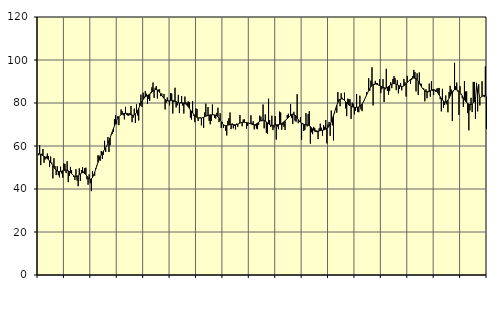
| Category | Piggar | Series 1 |
|---|---|---|
| nan | 55.7 | 56.43 |
| 87.0 | 60.3 | 56.22 |
| 87.0 | 51.1 | 56.12 |
| 87.0 | 56.4 | 55.76 |
| 87.0 | 58.6 | 55.48 |
| 87.0 | 52.2 | 55.18 |
| 87.0 | 53.7 | 54.89 |
| 87.0 | 55.1 | 54.53 |
| 87.0 | 56.5 | 54.13 |
| 87.0 | 55.2 | 53.66 |
| 87.0 | 50.2 | 53.07 |
| 87.0 | 55.1 | 52.41 |
| nan | 52.3 | 51.68 |
| 88.0 | 44.9 | 50.88 |
| 88.0 | 54.3 | 50.09 |
| 88.0 | 50.6 | 49.36 |
| 88.0 | 46.5 | 48.76 |
| 88.0 | 50.6 | 48.35 |
| 88.0 | 46.4 | 48.15 |
| 88.0 | 45.4 | 48.1 |
| 88.0 | 50.4 | 48.16 |
| 88.0 | 47.2 | 48.29 |
| 88.0 | 45.3 | 48.46 |
| 88.0 | 51.9 | 48.63 |
| nan | 51.6 | 48.72 |
| 89.0 | 47.4 | 48.76 |
| 89.0 | 52.9 | 48.68 |
| 89.0 | 43.2 | 48.45 |
| 89.0 | 46.1 | 48.09 |
| 89.0 | 50.3 | 47.63 |
| 89.0 | 48.7 | 47.11 |
| 89.0 | 46.7 | 46.6 |
| 89.0 | 45.6 | 46.17 |
| 89.0 | 44.2 | 45.87 |
| 89.0 | 49.2 | 45.8 |
| 89.0 | 43.9 | 45.92 |
| nan | 41.3 | 46.2 |
| 90.0 | 49.6 | 46.6 |
| 90.0 | 43.7 | 47.03 |
| 90.0 | 48.7 | 47.39 |
| 90.0 | 50.1 | 47.6 |
| 90.0 | 48.1 | 47.56 |
| 90.0 | 49.7 | 47.23 |
| 90.0 | 49.9 | 46.67 |
| 90.0 | 44.5 | 45.96 |
| 90.0 | 42 | 45.26 |
| 90.0 | 46.8 | 44.72 |
| 90.0 | 42.7 | 44.5 |
| nan | 39 | 44.72 |
| 91.0 | 48.3 | 45.38 |
| 91.0 | 46.2 | 46.44 |
| 91.0 | 46.2 | 47.8 |
| 91.0 | 49.7 | 49.32 |
| 91.0 | 51.1 | 50.86 |
| 91.0 | 55.7 | 52.36 |
| 91.0 | 55.5 | 53.71 |
| 91.0 | 53.1 | 54.91 |
| 91.0 | 57.7 | 55.95 |
| 91.0 | 54 | 56.85 |
| 91.0 | 56 | 57.63 |
| nan | 62.4 | 58.39 |
| 92.0 | 57.2 | 59.19 |
| 92.0 | 59.9 | 60.11 |
| 92.0 | 64.2 | 61.19 |
| 92.0 | 57.2 | 62.42 |
| 92.0 | 60.3 | 63.75 |
| 92.0 | 65.4 | 65.14 |
| 92.0 | 65.7 | 66.58 |
| 92.0 | 66.6 | 68.02 |
| 92.0 | 72.5 | 69.41 |
| 92.0 | 74.4 | 70.7 |
| 92.0 | 70.1 | 71.88 |
| nan | 73.8 | 72.87 |
| 93.0 | 69.7 | 73.63 |
| 93.0 | 74.2 | 74.2 |
| 93.0 | 77 | 74.6 |
| 93.0 | 76.2 | 74.87 |
| 93.0 | 74.3 | 75.05 |
| 93.0 | 72.4 | 75.16 |
| 93.0 | 78.2 | 75.18 |
| 93.0 | 74.6 | 75.17 |
| 93.0 | 74.2 | 75.08 |
| 93.0 | 74.1 | 74.91 |
| 93.0 | 75.3 | 74.69 |
| nan | 78.6 | 74.49 |
| 94.0 | 71.1 | 74.35 |
| 94.0 | 73.2 | 74.34 |
| 94.0 | 77.4 | 74.48 |
| 94.0 | 70.7 | 74.85 |
| 94.0 | 79.4 | 75.49 |
| 94.0 | 74.2 | 76.39 |
| 94.0 | 71.9 | 77.49 |
| 94.0 | 80 | 78.66 |
| 94.0 | 83.9 | 79.78 |
| 94.0 | 78.2 | 80.8 |
| 94.0 | 84.8 | 81.66 |
| nan | 83 | 82.32 |
| 95.0 | 85.6 | 82.81 |
| 95.0 | 84.3 | 83.2 |
| 95.0 | 79.6 | 83.52 |
| 95.0 | 81.9 | 83.82 |
| 95.0 | 81 | 84.18 |
| 95.0 | 85 | 84.58 |
| 95.0 | 87.3 | 85.04 |
| 95.0 | 89.5 | 85.53 |
| 95.0 | 82.4 | 85.94 |
| 95.0 | 87.1 | 86.21 |
| 95.0 | 87.9 | 86.27 |
| nan | 82.1 | 86.08 |
| 96.0 | 86.2 | 85.63 |
| 96.0 | 86.3 | 84.97 |
| 96.0 | 83.2 | 84.21 |
| 96.0 | 84.4 | 83.47 |
| 96.0 | 82.8 | 82.78 |
| 96.0 | 84.2 | 82.16 |
| 96.0 | 77 | 81.67 |
| 96.0 | 80.2 | 81.3 |
| 96.0 | 82.6 | 81.07 |
| 96.0 | 80.8 | 81.01 |
| 96.0 | 78.9 | 81.01 |
| nan | 84.6 | 81.04 |
| 97.0 | 84.4 | 81.09 |
| 97.0 | 75.1 | 81.1 |
| 97.0 | 80.4 | 81.02 |
| 97.0 | 87.1 | 80.86 |
| 97.0 | 77.9 | 80.63 |
| 97.0 | 78.9 | 80.36 |
| 97.0 | 83.8 | 80.14 |
| 97.0 | 75.3 | 80.03 |
| 97.0 | 80.2 | 80 |
| 97.0 | 83.2 | 80.02 |
| 97.0 | 78.8 | 80.06 |
| nan | 75.1 | 80.01 |
| 98.0 | 83 | 79.81 |
| 98.0 | 80.2 | 79.45 |
| 98.0 | 80.1 | 78.95 |
| 98.0 | 80.7 | 78.29 |
| 98.0 | 80.5 | 77.54 |
| 98.0 | 73.2 | 76.78 |
| 98.0 | 72.3 | 76.05 |
| 98.0 | 80.9 | 75.38 |
| 98.0 | 74 | 74.75 |
| 98.0 | 71.1 | 74.18 |
| 98.0 | 77.5 | 73.67 |
| nan | 77.2 | 73.29 |
| 99.0 | 71.6 | 73.07 |
| 99.0 | 73.2 | 72.98 |
| 99.0 | 73.2 | 72.98 |
| 99.0 | 69.6 | 73.04 |
| 99.0 | 73 | 73.15 |
| 99.0 | 68.4 | 73.34 |
| 99.0 | 75.6 | 73.59 |
| 99.0 | 79.7 | 73.85 |
| 99.0 | 73.9 | 74.09 |
| 99.0 | 78.1 | 74.28 |
| 99.0 | 71.7 | 74.41 |
| nan | 70.1 | 74.48 |
| 0.0 | 71.7 | 74.5 |
| 0.0 | 79.3 | 74.5 |
| 0.0 | 74.6 | 74.48 |
| 0.0 | 73 | 74.45 |
| 0.0 | 72.8 | 74.35 |
| 0.0 | 75.4 | 74.09 |
| 0.0 | 77.8 | 73.62 |
| 0.0 | 71.1 | 72.91 |
| 0.0 | 75.2 | 72.06 |
| 0.0 | 68.4 | 71.2 |
| 0.0 | 71.2 | 70.44 |
| nan | 68.5 | 69.9 |
| 1.0 | 69.4 | 69.59 |
| 1.0 | 67.1 | 69.48 |
| 1.0 | 64.9 | 69.53 |
| 1.0 | 71.7 | 69.66 |
| 1.0 | 72.9 | 69.83 |
| 1.0 | 75.6 | 69.97 |
| 1.0 | 67.9 | 70.04 |
| 1.0 | 70.5 | 70.02 |
| 1.0 | 68.2 | 69.95 |
| 1.0 | 69.3 | 69.89 |
| 1.0 | 67.7 | 69.9 |
| nan | 70.4 | 69.99 |
| 2.0 | 68.9 | 70.17 |
| 2.0 | 70.4 | 70.41 |
| 2.0 | 74.4 | 70.67 |
| 2.0 | 70.9 | 70.88 |
| 2.0 | 69.2 | 71.01 |
| 2.0 | 72.3 | 71.04 |
| 2.0 | 72.4 | 71.01 |
| 2.0 | 71.1 | 70.96 |
| 2.0 | 68.1 | 70.89 |
| 2.0 | 69.3 | 70.8 |
| 2.0 | 70.6 | 70.67 |
| nan | 70.3 | 70.51 |
| 3.0 | 74.3 | 70.3 |
| 3.0 | 70.7 | 70.1 |
| 3.0 | 71.5 | 69.94 |
| 3.0 | 67.7 | 69.89 |
| 3.0 | 69.5 | 70.02 |
| 3.0 | 68.1 | 70.31 |
| 3.0 | 67.8 | 70.68 |
| 3.0 | 69.9 | 71.09 |
| 3.0 | 74.1 | 71.48 |
| 3.0 | 73.6 | 71.8 |
| 3.0 | 71.5 | 71.99 |
| nan | 79.3 | 72.01 |
| 4.0 | 68.2 | 71.85 |
| 4.0 | 74.7 | 71.56 |
| 4.0 | 66.2 | 71.19 |
| 4.0 | 65.6 | 70.76 |
| 4.0 | 82 | 70.33 |
| 4.0 | 72.1 | 69.95 |
| 4.0 | 68.8 | 69.68 |
| 4.0 | 74.1 | 69.57 |
| 4.0 | 67.4 | 69.58 |
| 4.0 | 68.6 | 69.67 |
| 4.0 | 73.9 | 69.78 |
| nan | 63 | 69.85 |
| 5.0 | 69 | 69.89 |
| 5.0 | 67.8 | 69.92 |
| 5.0 | 76 | 69.98 |
| 5.0 | 75.6 | 70.16 |
| 5.0 | 67.6 | 70.45 |
| 5.0 | 69.8 | 70.82 |
| 5.0 | 68.9 | 71.27 |
| 5.0 | 67.5 | 71.73 |
| 5.0 | 72.1 | 72.2 |
| 5.0 | 74.4 | 72.7 |
| 5.0 | 75 | 73.2 |
| nan | 73.9 | 73.73 |
| 6.0 | 79.5 | 74.25 |
| 6.0 | 73 | 74.65 |
| 6.0 | 70.2 | 74.85 |
| 6.0 | 75.9 | 74.76 |
| 6.0 | 71.8 | 74.4 |
| 6.0 | 71.3 | 73.82 |
| 6.0 | 84.1 | 73.07 |
| 6.0 | 70.6 | 72.3 |
| 6.0 | 71.4 | 71.61 |
| 6.0 | 73.4 | 71.05 |
| 6.0 | 62.9 | 70.62 |
| nan | 70.7 | 70.31 |
| 7.0 | 67 | 70.1 |
| 7.0 | 67.5 | 69.96 |
| 7.0 | 75.3 | 69.91 |
| 7.0 | 69.1 | 69.86 |
| 7.0 | 74.8 | 69.72 |
| 7.0 | 76.2 | 69.45 |
| 7.0 | 61.1 | 69.03 |
| 7.0 | 66.4 | 68.47 |
| 7.0 | 65.5 | 67.88 |
| 7.0 | 68.9 | 67.32 |
| 7.0 | 68.3 | 66.9 |
| nan | 67.3 | 66.69 |
| 8.0 | 67.2 | 66.66 |
| 8.0 | 63.2 | 66.79 |
| 8.0 | 68.2 | 66.97 |
| 8.0 | 70.4 | 67.14 |
| 8.0 | 68.5 | 67.27 |
| 8.0 | 64.8 | 67.35 |
| 8.0 | 69.7 | 67.44 |
| 8.0 | 68.9 | 67.61 |
| 8.0 | 72.1 | 67.84 |
| 8.0 | 61.2 | 68.15 |
| 8.0 | 69.9 | 68.61 |
| nan | 71.2 | 69.27 |
| 9.0 | 64.7 | 70.17 |
| 9.0 | 76.5 | 71.32 |
| 9.0 | 69.6 | 72.69 |
| 9.0 | 62.6 | 74.2 |
| 9.0 | 75.2 | 75.83 |
| 9.0 | 76.9 | 77.47 |
| 9.0 | 75.5 | 78.97 |
| 9.0 | 85.1 | 80.19 |
| 9.0 | 81.7 | 81.09 |
| 9.0 | 78.5 | 81.67 |
| 9.0 | 84.5 | 81.94 |
| nan | 82.4 | 81.9 |
| 10.0 | 81.4 | 81.64 |
| 10.0 | 84.8 | 81.19 |
| 10.0 | 77.5 | 80.63 |
| 10.0 | 73.9 | 80.06 |
| 10.0 | 82 | 79.52 |
| 10.0 | 81.8 | 79.05 |
| 10.0 | 81.7 | 78.69 |
| 10.0 | 72.6 | 78.43 |
| 10.0 | 80.2 | 78.24 |
| 10.0 | 79.7 | 78.12 |
| 10.0 | 74.7 | 78.04 |
| nan | 76.4 | 77.97 |
| 11.0 | 84.2 | 77.95 |
| 11.0 | 75.9 | 78.02 |
| 11.0 | 75.7 | 78.19 |
| 11.0 | 83.4 | 78.47 |
| 11.0 | 77 | 78.93 |
| 11.0 | 76.2 | 79.56 |
| 11.0 | 80.5 | 80.36 |
| 11.0 | 81.2 | 81.33 |
| 11.0 | 82.6 | 82.43 |
| 11.0 | 85.1 | 83.59 |
| 11.0 | 84.6 | 84.73 |
| nan | 91.5 | 85.82 |
| 12.0 | 85.7 | 86.79 |
| 12.0 | 90.4 | 87.56 |
| 12.0 | 96.6 | 88.18 |
| 12.0 | 78.9 | 88.62 |
| 12.0 | 88.5 | 88.82 |
| 12.0 | 90.3 | 88.85 |
| 12.0 | 89.3 | 88.75 |
| 12.0 | 89.3 | 88.58 |
| 12.0 | 88.2 | 88.34 |
| 12.0 | 91.1 | 88.08 |
| 12.0 | 84.6 | 87.81 |
| nan | 86.4 | 87.54 |
| 13.0 | 91.1 | 87.28 |
| 13.0 | 80.5 | 87.09 |
| 13.0 | 86.4 | 86.98 |
| 13.0 | 95.9 | 87.03 |
| 13.0 | 85.6 | 87.29 |
| 13.0 | 83.9 | 87.66 |
| 13.0 | 85.5 | 88.09 |
| 13.0 | 89.7 | 88.5 |
| 13.0 | 86.9 | 88.81 |
| 13.0 | 91.2 | 88.98 |
| 13.0 | 92.5 | 89.02 |
| nan | 91.5 | 88.95 |
| 14.0 | 86 | 88.77 |
| 14.0 | 90.6 | 88.51 |
| 14.0 | 84.5 | 88.23 |
| 14.0 | 86.5 | 87.97 |
| 14.0 | 89.2 | 87.76 |
| 14.0 | 85.9 | 87.69 |
| 14.0 | 87.9 | 87.78 |
| 14.0 | 91.2 | 88.04 |
| 14.0 | 89.6 | 88.45 |
| 14.0 | 83 | 88.98 |
| 14.0 | 92.6 | 89.55 |
| nan | 90.1 | 90.09 |
| 15.0 | 90.7 | 90.58 |
| 15.0 | 89 | 91 |
| 15.0 | 90.7 | 91.32 |
| 15.0 | 92.5 | 91.54 |
| 15.0 | 95.4 | 91.62 |
| 15.0 | 94.4 | 91.54 |
| 15.0 | 85.4 | 91.27 |
| 15.0 | 93.8 | 90.77 |
| 15.0 | 83.7 | 90.09 |
| 15.0 | 94.2 | 89.27 |
| 15.0 | 89 | 88.39 |
| nan | 88.9 | 87.52 |
| 16.0 | 86.9 | 86.74 |
| 16.0 | 86.8 | 86.12 |
| 16.0 | 80.8 | 85.67 |
| 16.0 | 86.4 | 85.39 |
| 16.0 | 82.2 | 85.23 |
| 16.0 | 85.6 | 85.21 |
| 16.0 | 89 | 85.37 |
| 16.0 | 82.9 | 85.64 |
| 16.0 | 90.1 | 85.94 |
| 16.0 | 85.7 | 86.19 |
| 16.0 | 83.7 | 86.26 |
| nan | 85.8 | 86.13 |
| 17.0 | 85.2 | 85.8 |
| 17.0 | 86.7 | 85.29 |
| 17.0 | 86.9 | 84.59 |
| 17.0 | 87 | 83.76 |
| 17.0 | 81.8 | 82.92 |
| 17.0 | 76.1 | 82.17 |
| 17.0 | 86.6 | 81.47 |
| 17.0 | 77.8 | 80.88 |
| 17.0 | 79.1 | 80.49 |
| 17.0 | 83.5 | 80.38 |
| 17.0 | 79.4 | 80.66 |
| nan | 75.7 | 81.32 |
| 18.0 | 85.1 | 82.24 |
| 18.0 | 88 | 83.3 |
| 18.0 | 86.2 | 84.35 |
| 18.0 | 71.6 | 85.24 |
| 18.0 | 85.4 | 85.87 |
| 18.0 | 98.7 | 86.18 |
| 18.0 | 87.8 | 86.22 |
| 18.0 | 89.5 | 86.07 |
| 18.0 | 85.3 | 85.81 |
| 18.0 | 74.4 | 85.42 |
| 18.0 | 87.8 | 84.89 |
| nan | 83.8 | 84.22 |
| 19.0 | 82.2 | 83.37 |
| 19.0 | 78.2 | 82.43 |
| 19.0 | 90.2 | 81.53 |
| 19.0 | 85.3 | 80.8 |
| 19.0 | 85.4 | 80.25 |
| 19.0 | 75.3 | 79.82 |
| 19.0 | 67.3 | 79.49 |
| 19.0 | 76.6 | 79.29 |
| 19.0 | 82.4 | 79.28 |
| 19.0 | 75.8 | 79.52 |
| 19.0 | 89.8 | 79.96 |
| nan | 89.8 | 80.61 |
| 20.0 | 72.7 | 81.46 |
| 20.0 | 89.4 | 88.34 |
| 20.0 | 76.1 | 84.55 |
| 20.0 | 88.7 | 85.33 |
| 20.0 | 78.9 | 82.16 |
| 20.0 | 82.6 | 82.69 |
| 20.0 | 90.1 | 83.13 |
| 20.0 | 83.1 | 83.44 |
| 20.0 | 82.7 | 83.53 |
| 20.0 | 97 | 83.37 |
| 20.0 | 68 | 82.98 |